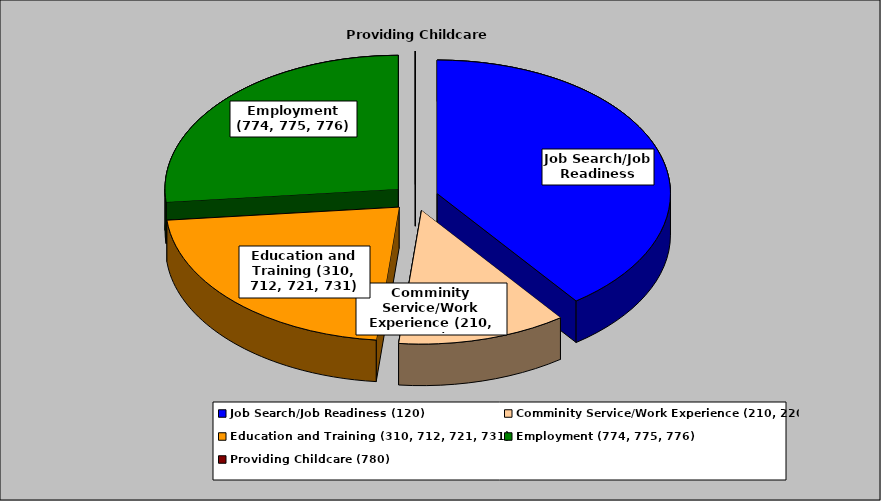
| Category | Series 0 |
|---|---|
| Job Search/Job Readiness (120) | 0.398 |
| Comminity Service/Work Experience (210, 220) | 0.117 |
| Education and Training (310, 712, 721, 731) | 0.219 |
| Employment (774, 775, 776) | 0.266 |
| Providing Childcare (780) | 0 |